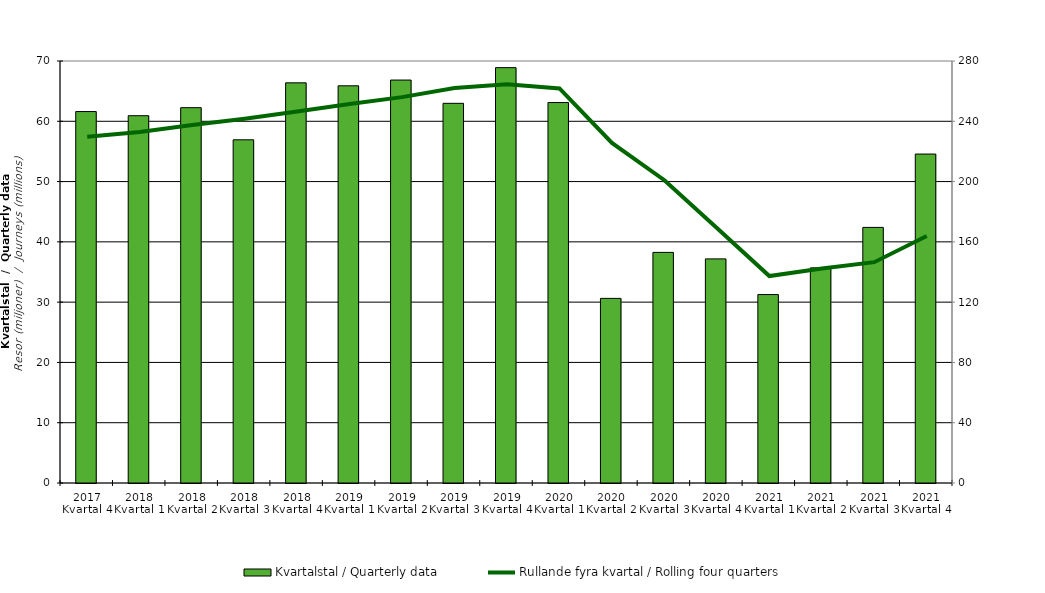
| Category | Kvartalstal / Quarterly data |
|---|---|
| 2017 Kvartal 4 | 61.615 |
| 2018 Kvartal 1 | 60.926 |
| 2018 Kvartal 2 | 62.259 |
| 2018 Kvartal 3 | 56.927 |
| 2018 Kvartal 4 | 66.378 |
| 2019 Kvartal 1 | 65.885 |
| 2019 Kvartal 2 | 66.84 |
| 2019 Kvartal 3 | 62.979 |
| 2019 Kvartal 4 | 68.898 |
| 2020 Kvartal 1 | 63.109 |
| 2020 Kvartal 2 | 30.624 |
| 2020 Kvartal 3 | 38.255 |
| 2020 Kvartal 4 | 37.175 |
| 2021 Kvartal 1 | 31.258 |
| 2021 Kvartal 2 | 35.687 |
| 2021 Kvartal 3 | 42.399 |
| 2021 Kvartal 4 | 54.564 |